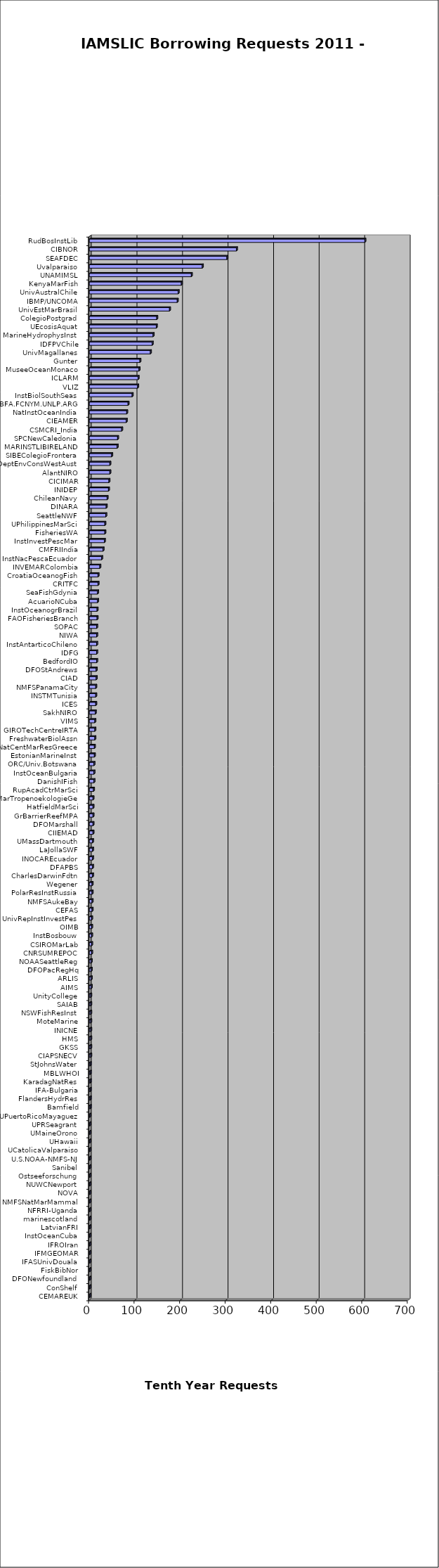
| Category | Series 0 |
|---|---|
| CEMAREUK  | 1 |
| ConShelf  | 1 |
| DFONewfoundland  | 1 |
| FiskBibNor  | 1 |
| IFASUnivDouala  | 1 |
| IFMGEOMAR  | 1 |
| IFROIran  | 1 |
| InstOceanCuba  | 1 |
| LatvianFRI  | 1 |
| marinescotland  | 1 |
| NFRRI-Uganda  | 1 |
| NMFSNatMarMammal  | 1 |
| NOVA  | 1 |
| NUWCNewport  | 1 |
| Ostseeforschung  | 1 |
| Sanibel  | 1 |
| U.S.NOAA-NMFS-NJ  | 1 |
| UCatolicaValparaiso  | 1 |
| UHawaii  | 1 |
| UMaineOrono  | 1 |
| UPRSeagrant  | 1 |
| UPuertoRicoMayaguez  | 1 |
| Bamfield  | 2 |
| FlandersHydrRes  | 2 |
| IFA-Bulgaria  | 2 |
| KaradagNatRes  | 2 |
| MBLWHOI  | 2 |
| StJohnsWater  | 2 |
| CIAPSNECV  | 3 |
| GKSS  | 3 |
| HMS  | 3 |
| INICNE  | 3 |
| MoteMarine  | 3 |
| NSWFishResInst  | 3 |
| SAIAB  | 3 |
| UnityCollege  | 3 |
| AIMS  | 4 |
| ARLIS  | 4 |
| DFOPacRegHq  | 4 |
| NOAASeattleReg  | 4 |
| CNRSUMREPOC  | 5 |
| CSIROMarLab  | 5 |
| InstBosbouw  | 5 |
| OIMB  | 5 |
| UnivRepInstInvestPes  | 5 |
| CEFAS  | 6 |
| NMFSAukeBay  | 6 |
| PolarResInstRussia  | 6 |
| Wegener  | 6 |
| CharlesDarwinFdtn  | 7 |
| DFAPBS  | 7 |
| INOCAREcuador  | 7 |
| LaJollaSWF  | 7 |
| UMassDartmouth  | 7 |
| CIIEMAD  | 8 |
| DFOMarshall  | 8 |
| GrBarrierReefMPA  | 8 |
| HatfieldMarSci  | 8 |
| MarTropenoekologieGe  | 8 |
| RupAcadCtrMarSci  | 9 |
| DanishIFish  | 10 |
| InstOceanBulgaria  | 10 |
| ORC/Univ.Botswana  | 10 |
| EstonianMarineInst  | 11 |
| NatCentMarResGreece  | 11 |
| FreshwaterBiolAssn  | 12 |
| GIROTechCentreIRTA  | 12 |
| VIMS  | 12 |
| SakhNIRO  | 13 |
| ICES  | 14 |
| INSTMTunisia  | 14 |
| NMFSPanamaCity  | 14 |
| CIAD  | 15 |
| DFOStAndrews  | 15 |
| BedfordIO  | 16 |
| IDFG  | 16 |
| InstAntarticoChileno  | 16 |
| NIWA  | 16 |
| SOPAC  | 16 |
| FAOFisheriesBranch  | 17 |
| InstOceanogrBrazil  | 17 |
| AcuarioNCuba  | 18 |
| SeaFishGdynia  | 18 |
| CRITFC  | 19 |
| CroatiaOceanogFish  | 19 |
| INVEMARColombia  | 23 |
| InstNacPescaEcuador  | 27 |
| CMFRIIndia  | 30 |
| InstInvestPescMar  | 33 |
| FisheriesWA  | 34 |
| UPhilippinesMarSci  | 34 |
| SeattleNWF  | 36 |
| DINARA  | 37 |
| ChileanNavy  | 39 |
| INIDEP  | 42 |
| CICIMAR  | 43 |
| AlantNIRO  | 45 |
| DeptEnvConsWestAust  | 45 |
| SIBEColegioFrontera  | 49 |
| MARINSTLIBIRELAND  | 61 |
| SPCNewCaledonia  | 62 |
| CSMCRI_India  | 71 |
| CIEAMER  | 81 |
| NatInstOceanIndia  | 82 |
| BFA.FCNYM.UNLP.ARG  | 85 |
| InstBiolSouthSeas  | 94 |
| VLIZ  | 106 |
| ICLARM  | 107 |
| MuseeOceanMonaco  | 109 |
| Gunter  | 111 |
| UnivMagallanes  | 134 |
| IDFPVChile  | 138 |
| MarineHydrophysInst  | 140 |
| UEcosisAquat  | 147 |
| ColegioPostgrad  | 148 |
| UnivEstMarBrasil  | 176 |
| IBMP/UNCOMA  | 193 |
| UnivAustralChile  | 195 |
| KenyaMarFish  | 202 |
| UNAMIMSL  | 224 |
| Uvalparaiso  | 248 |
| SEAFDEC  | 302 |
| CIBNOR  | 323 |
| RudBosInstLib  | 605 |